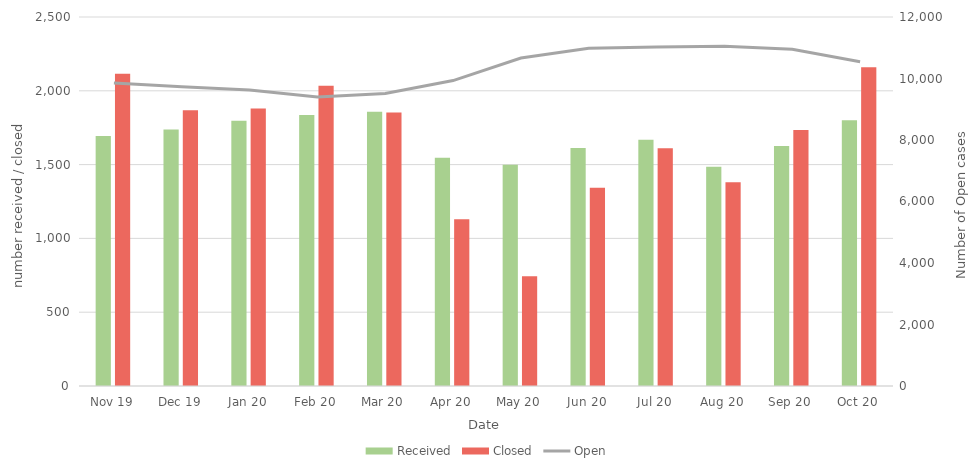
| Category | Received | Closed |
|---|---|---|
| Nov 19 | 1693 | 2116 |
| Dec 19 | 1737 | 1868 |
| Jan 20 | 1797 | 1880 |
| Feb 20 | 1836 | 2035 |
| Mar 20 | 1858 | 1853 |
| Apr 20 | 1546 | 1129 |
| May 20 | 1499 | 743 |
| Jun 20 | 1613 | 1344 |
| Jul 20 | 1668 | 1611 |
| Aug 20 | 1486 | 1380 |
| Sep 20 | 1626 | 1734 |
| Oct 20 | 1801 | 2159 |